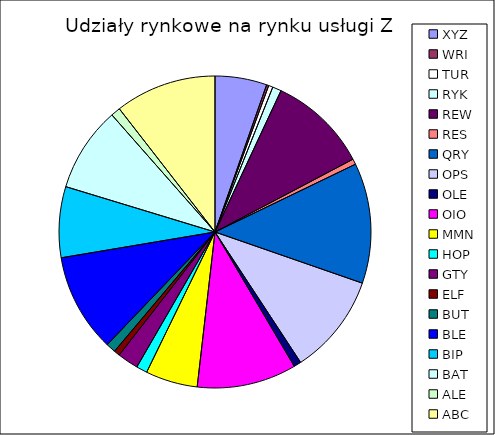
| Category | Sprzedaż |
|---|---|
| XYZ | 473.418 |
| WRI | 20 |
| TUR | 39.155 |
| RYK | 80.62 |
| REW | 910 |
| RES | 50.124 |
| QRY | 1100 |
| OPS | 920 |
| OLE | 67 |
| OIO | 909.35 |
| MMN | 475.7 |
| HOP | 100 |
| GTY | 192.06 |
| ELF | 54.319 |
| BUT | 88 |
| BLE | 900 |
| BIP | 647.453 |
| BAT | 777 |
| ALE | 87 |
| ABC | 926.542 |